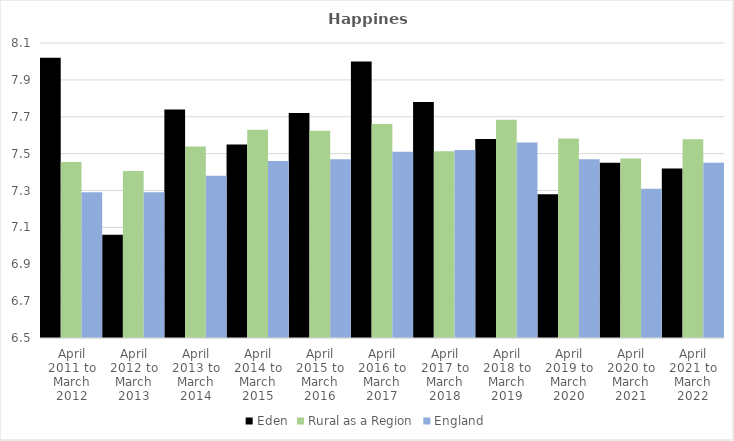
| Category | Eden | Rural as a Region | England |
|---|---|---|---|
| April 2011 to March 2012 | 8.02 | 7.454 | 7.29 |
| April 2012 to March 2013 | 7.06 | 7.406 | 7.29 |
| April 2013 to March 2014 | 7.74 | 7.539 | 7.38 |
| April 2014 to March 2015 | 7.55 | 7.63 | 7.46 |
| April 2015 to March 2016 | 7.72 | 7.625 | 7.47 |
| April 2016 to March 2017 | 8 | 7.661 | 7.51 |
| April 2017 to March 2018 | 7.78 | 7.513 | 7.52 |
| April 2018 to March 2019 | 7.58 | 7.684 | 7.56 |
| April 2019 to March 2020 | 7.28 | 7.582 | 7.47 |
| April 2020 to March 2021 | 7.45 | 7.474 | 7.31 |
| April 2021 to March 2022 | 7.42 | 7.577 | 7.45 |